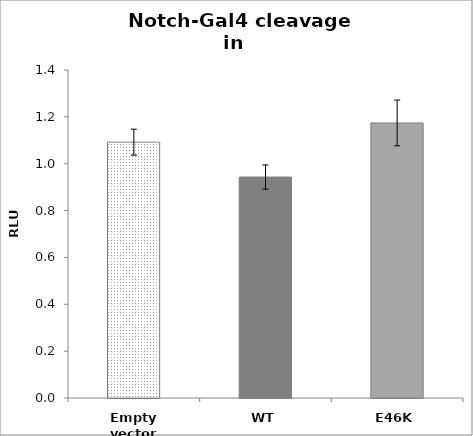
| Category | Series 0 |
|---|---|
| Empty vector | 1.092 |
| WT | 0.943 |
| E46K | 1.174 |